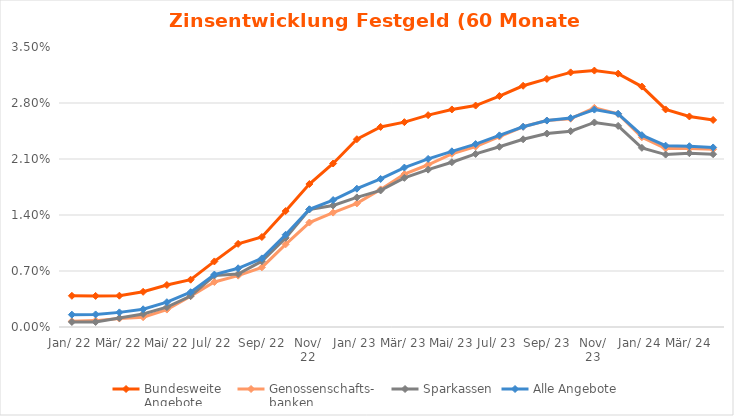
| Category | Bundesweite
Angebote | Genossenschafts-
banken | Sparkassen | Alle Angebote |
|---|---|---|---|---|
| Jan. 22 | 0.004 | 0.001 | 0.001 | 0.002 |
| Feb. 22 | 0.004 | 0.001 | 0.001 | 0.002 |
| Mrz. 22 | 0.004 | 0.001 | 0.001 | 0.002 |
| Apr. 22 | 0.004 | 0.001 | 0.002 | 0.002 |
| Mai. 22 | 0.005 | 0.002 | 0.002 | 0.003 |
| Jun. 22 | 0.006 | 0.004 | 0.004 | 0.004 |
| Jul. 22 | 0.008 | 0.006 | 0.006 | 0.007 |
| Aug. 22 | 0.01 | 0.006 | 0.007 | 0.007 |
| Sep. 22 | 0.011 | 0.007 | 0.008 | 0.009 |
| Okt. 22 | 0.014 | 0.01 | 0.011 | 0.012 |
| Nov. 22 | 0.018 | 0.013 | 0.015 | 0.015 |
| Dez. 22 | 0.02 | 0.014 | 0.015 | 0.016 |
| Jan. 23 | 0.023 | 0.015 | 0.016 | 0.017 |
| Feb. 23 | 0.025 | 0.017 | 0.017 | 0.019 |
| Mrz. 23 | 0.026 | 0.019 | 0.019 | 0.02 |
| Apr. 23 | 0.026 | 0.02 | 0.02 | 0.021 |
| Mai. 23 | 0.027 | 0.022 | 0.021 | 0.022 |
| Jun. 23 | 0.028 | 0.023 | 0.022 | 0.023 |
| Jul. 23 | 0.029 | 0.024 | 0.023 | 0.024 |
| Aug. 23 | 0.03 | 0.025 | 0.023 | 0.025 |
| Sep. 23 | 0.031 | 0.026 | 0.024 | 0.026 |
| Okt. 23 | 0.032 | 0.026 | 0.024 | 0.026 |
| Nov. 23 | 0.032 | 0.027 | 0.026 | 0.027 |
| Dez. 23 | 0.032 | 0.027 | 0.025 | 0.027 |
| Jan. 24 | 0.03 | 0.024 | 0.022 | 0.024 |
| Feb. 24 | 0.027 | 0.022 | 0.022 | 0.023 |
| Mrz. 24 | 0.026 | 0.022 | 0.022 | 0.023 |
| Akt. | 0.026 | 0.022 | 0.022 | 0.022 |